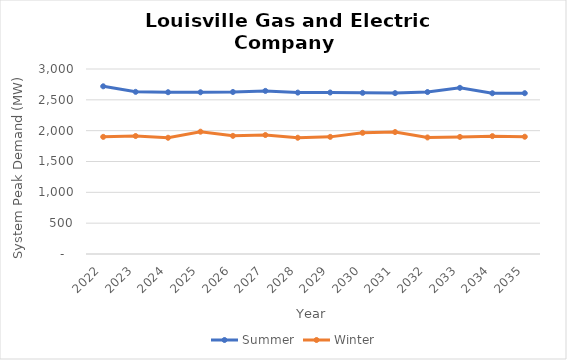
| Category | Summer | Winter |
|---|---|---|
| 2022.0 | 2719.44 | 1899.335 |
| 2023.0 | 2629.626 | 1913.193 |
| 2024.0 | 2623.393 | 1885.146 |
| 2025.0 | 2622.755 | 1983.312 |
| 2026.0 | 2627.209 | 1915.916 |
| 2027.0 | 2644.841 | 1929.298 |
| 2028.0 | 2617.352 | 1885.497 |
| 2029.0 | 2618.679 | 1899.381 |
| 2030.0 | 2613.242 | 1965.14 |
| 2031.0 | 2608.848 | 1977.656 |
| 2032.0 | 2626.288 | 1889.988 |
| 2033.0 | 2694.576 | 1898.602 |
| 2034.0 | 2606.558 | 1911.464 |
| 2035.0 | 2607.83 | 1901.412 |